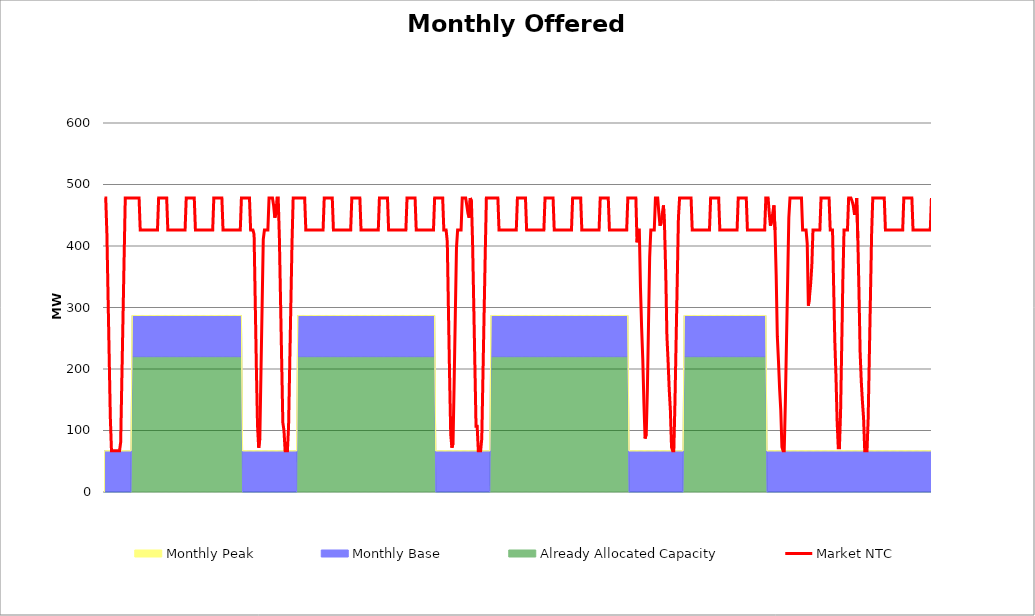
| Category | Market NTC |
|---|---|
| 0 | 478 |
| 1 | 478 |
| 2 | 421 |
| 3 | 321 |
| 4 | 221 |
| 5 | 121 |
| 6 | 67 |
| 7 | 67 |
| 8 | 67 |
| 9 | 67 |
| 10 | 67 |
| 11 | 67 |
| 12 | 67 |
| 13 | 67 |
| 14 | 81 |
| 15 | 181 |
| 16 | 281 |
| 17 | 381 |
| 18 | 478 |
| 19 | 478 |
| 20 | 478 |
| 21 | 478 |
| 22 | 478 |
| 23 | 478 |
| 24 | 478 |
| 25 | 478 |
| 26 | 478 |
| 27 | 478 |
| 28 | 478 |
| 29 | 478 |
| 30 | 478 |
| 31 | 426 |
| 32 | 426 |
| 33 | 426 |
| 34 | 426 |
| 35 | 426 |
| 36 | 426 |
| 37 | 426 |
| 38 | 426 |
| 39 | 426 |
| 40 | 426 |
| 41 | 426 |
| 42 | 426 |
| 43 | 426 |
| 44 | 426 |
| 45 | 426 |
| 46 | 426 |
| 47 | 478 |
| 48 | 478 |
| 49 | 478 |
| 50 | 478 |
| 51 | 478 |
| 52 | 478 |
| 53 | 478 |
| 54 | 478 |
| 55 | 426 |
| 56 | 426 |
| 57 | 426 |
| 58 | 426 |
| 59 | 426 |
| 60 | 426 |
| 61 | 426 |
| 62 | 426 |
| 63 | 426 |
| 64 | 426 |
| 65 | 426 |
| 66 | 426 |
| 67 | 426 |
| 68 | 426 |
| 69 | 426 |
| 70 | 426 |
| 71 | 478 |
| 72 | 478 |
| 73 | 478 |
| 74 | 478 |
| 75 | 478 |
| 76 | 478 |
| 77 | 478 |
| 78 | 478 |
| 79 | 426 |
| 80 | 426 |
| 81 | 426 |
| 82 | 426 |
| 83 | 426 |
| 84 | 426 |
| 85 | 426 |
| 86 | 426 |
| 87 | 426 |
| 88 | 426 |
| 89 | 426 |
| 90 | 426 |
| 91 | 426 |
| 92 | 426 |
| 93 | 426 |
| 94 | 426 |
| 95 | 478 |
| 96 | 478 |
| 97 | 478 |
| 98 | 478 |
| 99 | 478 |
| 100 | 478 |
| 101 | 478 |
| 102 | 478 |
| 103 | 426 |
| 104 | 426 |
| 105 | 426 |
| 106 | 426 |
| 107 | 426 |
| 108 | 426 |
| 109 | 426 |
| 110 | 426 |
| 111 | 426 |
| 112 | 426 |
| 113 | 426 |
| 114 | 426 |
| 115 | 426 |
| 116 | 426 |
| 117 | 426 |
| 118 | 426 |
| 119 | 478 |
| 120 | 478 |
| 121 | 478 |
| 122 | 478 |
| 123 | 478 |
| 124 | 478 |
| 125 | 478 |
| 126 | 478 |
| 127 | 426 |
| 128 | 426 |
| 129 | 426 |
| 130 | 419 |
| 131 | 310 |
| 132 | 202 |
| 133 | 108 |
| 134 | 72 |
| 135 | 87 |
| 136 | 195 |
| 137 | 303 |
| 138 | 411 |
| 139 | 426 |
| 140 | 426 |
| 141 | 426 |
| 142 | 426 |
| 143 | 478 |
| 144 | 478 |
| 145 | 478 |
| 146 | 478 |
| 147 | 466 |
| 148 | 446 |
| 149 | 453 |
| 150 | 478 |
| 151 | 478 |
| 152 | 413 |
| 153 | 313 |
| 154 | 213 |
| 155 | 113 |
| 156 | 100 |
| 157 | 67 |
| 158 | 67 |
| 159 | 67 |
| 160 | 107 |
| 161 | 207 |
| 162 | 307 |
| 163 | 406 |
| 164 | 478 |
| 165 | 478 |
| 166 | 478 |
| 167 | 478 |
| 168 | 478 |
| 169 | 478 |
| 170 | 478 |
| 171 | 478 |
| 172 | 478 |
| 173 | 478 |
| 174 | 478 |
| 175 | 426 |
| 176 | 426 |
| 177 | 426 |
| 178 | 426 |
| 179 | 426 |
| 180 | 426 |
| 181 | 426 |
| 182 | 426 |
| 183 | 426 |
| 184 | 426 |
| 185 | 426 |
| 186 | 426 |
| 187 | 426 |
| 188 | 426 |
| 189 | 426 |
| 190 | 426 |
| 191 | 478 |
| 192 | 478 |
| 193 | 478 |
| 194 | 478 |
| 195 | 478 |
| 196 | 478 |
| 197 | 478 |
| 198 | 478 |
| 199 | 426 |
| 200 | 426 |
| 201 | 426 |
| 202 | 426 |
| 203 | 426 |
| 204 | 426 |
| 205 | 426 |
| 206 | 426 |
| 207 | 426 |
| 208 | 426 |
| 209 | 426 |
| 210 | 426 |
| 211 | 426 |
| 212 | 426 |
| 213 | 426 |
| 214 | 426 |
| 215 | 478 |
| 216 | 478 |
| 217 | 478 |
| 218 | 478 |
| 219 | 478 |
| 220 | 478 |
| 221 | 478 |
| 222 | 478 |
| 223 | 426 |
| 224 | 426 |
| 225 | 426 |
| 226 | 426 |
| 227 | 426 |
| 228 | 426 |
| 229 | 426 |
| 230 | 426 |
| 231 | 426 |
| 232 | 426 |
| 233 | 426 |
| 234 | 426 |
| 235 | 426 |
| 236 | 426 |
| 237 | 426 |
| 238 | 426 |
| 239 | 478 |
| 240 | 478 |
| 241 | 478 |
| 242 | 478 |
| 243 | 478 |
| 244 | 478 |
| 245 | 478 |
| 246 | 478 |
| 247 | 426 |
| 248 | 426 |
| 249 | 426 |
| 250 | 426 |
| 251 | 426 |
| 252 | 426 |
| 253 | 426 |
| 254 | 426 |
| 255 | 426 |
| 256 | 426 |
| 257 | 426 |
| 258 | 426 |
| 259 | 426 |
| 260 | 426 |
| 261 | 426 |
| 262 | 426 |
| 263 | 478 |
| 264 | 478 |
| 265 | 478 |
| 266 | 478 |
| 267 | 478 |
| 268 | 478 |
| 269 | 478 |
| 270 | 478 |
| 271 | 426 |
| 272 | 426 |
| 273 | 426 |
| 274 | 426 |
| 275 | 426 |
| 276 | 426 |
| 277 | 426 |
| 278 | 426 |
| 279 | 426 |
| 280 | 426 |
| 281 | 426 |
| 282 | 426 |
| 283 | 426 |
| 284 | 426 |
| 285 | 426 |
| 286 | 426 |
| 287 | 478 |
| 288 | 478 |
| 289 | 478 |
| 290 | 478 |
| 291 | 478 |
| 292 | 478 |
| 293 | 478 |
| 294 | 478 |
| 295 | 426 |
| 296 | 426 |
| 297 | 426 |
| 298 | 407 |
| 299 | 298 |
| 300 | 190 |
| 301 | 94 |
| 302 | 72 |
| 303 | 79 |
| 304 | 180 |
| 305 | 289 |
| 306 | 397 |
| 307 | 426 |
| 308 | 426 |
| 309 | 426 |
| 310 | 426 |
| 311 | 478 |
| 312 | 478 |
| 313 | 478 |
| 314 | 478 |
| 315 | 466 |
| 316 | 453 |
| 317 | 446 |
| 318 | 478 |
| 319 | 473 |
| 320 | 406 |
| 321 | 307 |
| 322 | 207 |
| 323 | 107 |
| 324 | 107 |
| 325 | 67 |
| 326 | 67 |
| 327 | 67 |
| 328 | 87 |
| 329 | 187 |
| 330 | 287 |
| 331 | 386 |
| 332 | 478 |
| 333 | 478 |
| 334 | 478 |
| 335 | 478 |
| 336 | 478 |
| 337 | 478 |
| 338 | 478 |
| 339 | 478 |
| 340 | 478 |
| 341 | 478 |
| 342 | 478 |
| 343 | 426 |
| 344 | 426 |
| 345 | 426 |
| 346 | 426 |
| 347 | 426 |
| 348 | 426 |
| 349 | 426 |
| 350 | 426 |
| 351 | 426 |
| 352 | 426 |
| 353 | 426 |
| 354 | 426 |
| 355 | 426 |
| 356 | 426 |
| 357 | 426 |
| 358 | 426 |
| 359 | 478 |
| 360 | 478 |
| 361 | 478 |
| 362 | 478 |
| 363 | 478 |
| 364 | 478 |
| 365 | 478 |
| 366 | 478 |
| 367 | 426 |
| 368 | 426 |
| 369 | 426 |
| 370 | 426 |
| 371 | 426 |
| 372 | 426 |
| 373 | 426 |
| 374 | 426 |
| 375 | 426 |
| 376 | 426 |
| 377 | 426 |
| 378 | 426 |
| 379 | 426 |
| 380 | 426 |
| 381 | 426 |
| 382 | 426 |
| 383 | 478 |
| 384 | 478 |
| 385 | 478 |
| 386 | 478 |
| 387 | 478 |
| 388 | 478 |
| 389 | 478 |
| 390 | 478 |
| 391 | 426 |
| 392 | 426 |
| 393 | 426 |
| 394 | 426 |
| 395 | 426 |
| 396 | 426 |
| 397 | 426 |
| 398 | 426 |
| 399 | 426 |
| 400 | 426 |
| 401 | 426 |
| 402 | 426 |
| 403 | 426 |
| 404 | 426 |
| 405 | 426 |
| 406 | 426 |
| 407 | 478 |
| 408 | 478 |
| 409 | 478 |
| 410 | 478 |
| 411 | 478 |
| 412 | 478 |
| 413 | 478 |
| 414 | 478 |
| 415 | 426 |
| 416 | 426 |
| 417 | 426 |
| 418 | 426 |
| 419 | 426 |
| 420 | 426 |
| 421 | 426 |
| 422 | 426 |
| 423 | 426 |
| 424 | 426 |
| 425 | 426 |
| 426 | 426 |
| 427 | 426 |
| 428 | 426 |
| 429 | 426 |
| 430 | 426 |
| 431 | 478 |
| 432 | 478 |
| 433 | 478 |
| 434 | 478 |
| 435 | 478 |
| 436 | 478 |
| 437 | 478 |
| 438 | 478 |
| 439 | 426 |
| 440 | 426 |
| 441 | 426 |
| 442 | 426 |
| 443 | 426 |
| 444 | 426 |
| 445 | 426 |
| 446 | 426 |
| 447 | 426 |
| 448 | 426 |
| 449 | 426 |
| 450 | 426 |
| 451 | 426 |
| 452 | 426 |
| 453 | 426 |
| 454 | 426 |
| 455 | 478 |
| 456 | 478 |
| 457 | 478 |
| 458 | 478 |
| 459 | 478 |
| 460 | 478 |
| 461 | 478 |
| 462 | 478 |
| 463 | 406 |
| 464 | 426 |
| 465 | 426 |
| 466 | 332 |
| 467 | 267 |
| 468 | 216 |
| 469 | 144 |
| 470 | 87 |
| 471 | 94 |
| 472 | 166 |
| 473 | 274 |
| 474 | 382 |
| 475 | 426 |
| 476 | 426 |
| 477 | 426 |
| 478 | 426 |
| 479 | 478 |
| 480 | 478 |
| 481 | 478 |
| 482 | 453 |
| 483 | 433 |
| 484 | 440 |
| 485 | 453 |
| 486 | 466 |
| 487 | 426 |
| 488 | 353 |
| 489 | 253 |
| 490 | 213 |
| 491 | 167 |
| 492 | 133 |
| 493 | 73 |
| 494 | 67 |
| 495 | 67 |
| 496 | 147 |
| 497 | 247 |
| 498 | 346 |
| 499 | 446 |
| 500 | 478 |
| 501 | 478 |
| 502 | 478 |
| 503 | 478 |
| 504 | 478 |
| 505 | 478 |
| 506 | 478 |
| 507 | 478 |
| 508 | 478 |
| 509 | 478 |
| 510 | 478 |
| 511 | 426 |
| 512 | 426 |
| 513 | 426 |
| 514 | 426 |
| 515 | 426 |
| 516 | 426 |
| 517 | 426 |
| 518 | 426 |
| 519 | 426 |
| 520 | 426 |
| 521 | 426 |
| 522 | 426 |
| 523 | 426 |
| 524 | 426 |
| 525 | 426 |
| 526 | 426 |
| 527 | 478 |
| 528 | 478 |
| 529 | 478 |
| 530 | 478 |
| 531 | 478 |
| 532 | 478 |
| 533 | 478 |
| 534 | 478 |
| 535 | 426 |
| 536 | 426 |
| 537 | 426 |
| 538 | 426 |
| 539 | 426 |
| 540 | 426 |
| 541 | 426 |
| 542 | 426 |
| 543 | 426 |
| 544 | 426 |
| 545 | 426 |
| 546 | 426 |
| 547 | 426 |
| 548 | 426 |
| 549 | 426 |
| 550 | 426 |
| 551 | 478 |
| 552 | 478 |
| 553 | 478 |
| 554 | 478 |
| 555 | 478 |
| 556 | 478 |
| 557 | 478 |
| 558 | 478 |
| 559 | 426 |
| 560 | 426 |
| 561 | 426 |
| 562 | 426 |
| 563 | 426 |
| 564 | 426 |
| 565 | 426 |
| 566 | 426 |
| 567 | 426 |
| 568 | 426 |
| 569 | 426 |
| 570 | 426 |
| 571 | 426 |
| 572 | 426 |
| 573 | 426 |
| 574 | 426 |
| 575 | 478 |
| 576 | 478 |
| 577 | 478 |
| 578 | 453 |
| 579 | 433 |
| 580 | 440 |
| 581 | 453 |
| 582 | 466 |
| 583 | 426 |
| 584 | 353 |
| 585 | 253 |
| 586 | 213 |
| 587 | 167 |
| 588 | 133 |
| 589 | 73 |
| 590 | 67 |
| 591 | 67 |
| 592 | 147 |
| 593 | 247 |
| 594 | 346 |
| 595 | 446 |
| 596 | 478 |
| 597 | 478 |
| 598 | 478 |
| 599 | 478 |
| 600 | 478 |
| 601 | 478 |
| 602 | 478 |
| 603 | 478 |
| 604 | 478 |
| 605 | 478 |
| 606 | 478 |
| 607 | 426 |
| 608 | 426 |
| 609 | 426 |
| 610 | 426 |
| 611 | 404 |
| 612 | 303 |
| 613 | 318 |
| 614 | 339 |
| 615 | 368 |
| 616 | 426 |
| 617 | 426 |
| 618 | 426 |
| 619 | 426 |
| 620 | 426 |
| 621 | 426 |
| 622 | 426 |
| 623 | 478 |
| 624 | 478 |
| 625 | 478 |
| 626 | 478 |
| 627 | 478 |
| 628 | 478 |
| 629 | 478 |
| 630 | 478 |
| 631 | 426 |
| 632 | 426 |
| 633 | 426 |
| 634 | 332 |
| 635 | 245 |
| 636 | 188 |
| 637 | 115 |
| 638 | 72 |
| 639 | 72 |
| 640 | 130 |
| 641 | 238 |
| 642 | 346 |
| 643 | 426 |
| 644 | 426 |
| 645 | 426 |
| 646 | 426 |
| 647 | 478 |
| 648 | 478 |
| 649 | 478 |
| 650 | 473 |
| 651 | 466 |
| 652 | 453 |
| 653 | 453 |
| 654 | 478 |
| 655 | 413 |
| 656 | 326 |
| 657 | 227 |
| 658 | 180 |
| 659 | 147 |
| 660 | 120 |
| 661 | 67 |
| 662 | 67 |
| 663 | 67 |
| 664 | 120 |
| 665 | 220 |
| 666 | 320 |
| 667 | 420 |
| 668 | 478 |
| 669 | 478 |
| 670 | 478 |
| 671 | 478 |
| 672 | 478 |
| 673 | 478 |
| 674 | 478 |
| 675 | 478 |
| 676 | 478 |
| 677 | 478 |
| 678 | 478 |
| 679 | 426 |
| 680 | 426 |
| 681 | 426 |
| 682 | 426 |
| 683 | 426 |
| 684 | 426 |
| 685 | 426 |
| 686 | 426 |
| 687 | 426 |
| 688 | 426 |
| 689 | 426 |
| 690 | 426 |
| 691 | 426 |
| 692 | 426 |
| 693 | 426 |
| 694 | 426 |
| 695 | 478 |
| 696 | 478 |
| 697 | 478 |
| 698 | 478 |
| 699 | 478 |
| 700 | 478 |
| 701 | 478 |
| 702 | 478 |
| 703 | 426 |
| 704 | 426 |
| 705 | 426 |
| 706 | 426 |
| 707 | 426 |
| 708 | 426 |
| 709 | 426 |
| 710 | 426 |
| 711 | 426 |
| 712 | 426 |
| 713 | 426 |
| 714 | 426 |
| 715 | 426 |
| 716 | 426 |
| 717 | 426 |
| 718 | 426 |
| 719 | 478 |